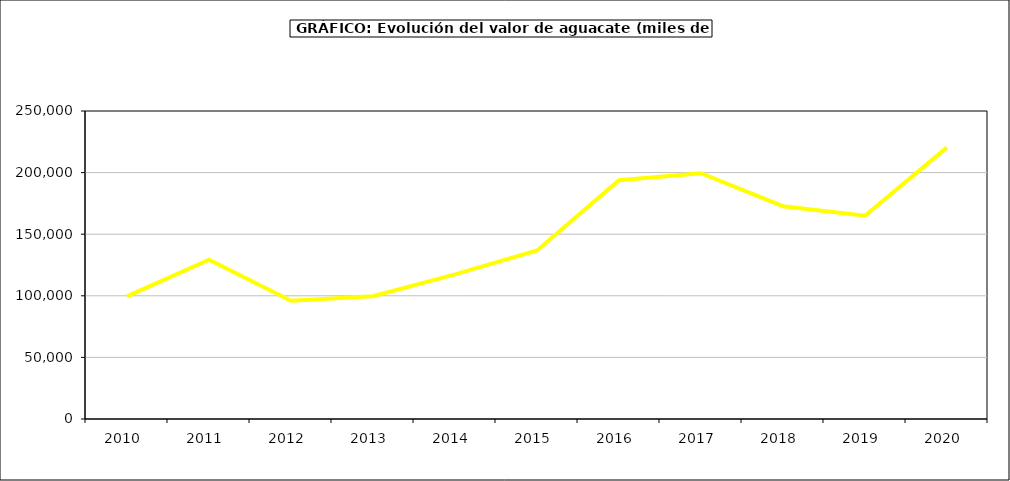
| Category | valor aguacate |
|---|---|
| 2010.0 | 99524.152 |
| 2011.0 | 129297.627 |
| 2012.0 | 96001.411 |
| 2013.0 | 99613.86 |
| 2014.0 | 117384.488 |
| 2015.0 | 136798 |
| 2016.0 | 193742 |
| 2017.0 | 199459.243 |
| 2018.0 | 172742.335 |
| 2019.0 | 164992.494 |
| 2020.0 | 220493.65 |